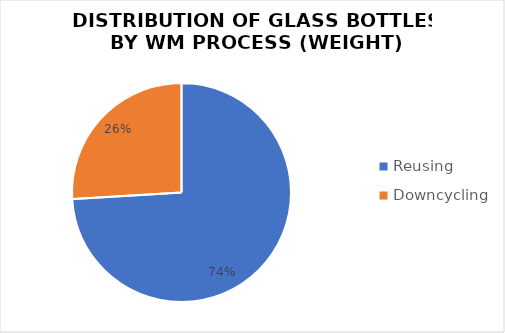
| Category | Series 0 |
|---|---|
| Reusing  | 1026.99 |
| Downcycling | 360.009 |